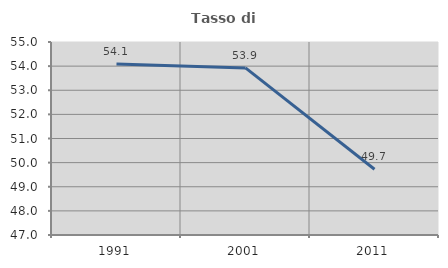
| Category | Tasso di occupazione   |
|---|---|
| 1991.0 | 54.09 |
| 2001.0 | 53.925 |
| 2011.0 | 49.724 |